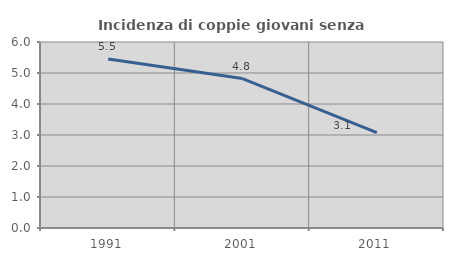
| Category | Incidenza di coppie giovani senza figli |
|---|---|
| 1991.0 | 5.451 |
| 2001.0 | 4.819 |
| 2011.0 | 3.08 |